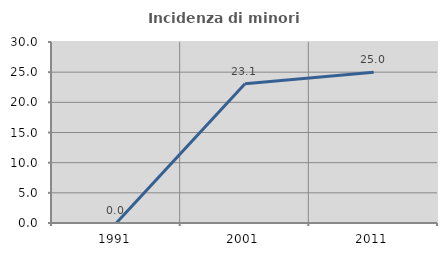
| Category | Incidenza di minori stranieri |
|---|---|
| 1991.0 | 0 |
| 2001.0 | 23.077 |
| 2011.0 | 25 |